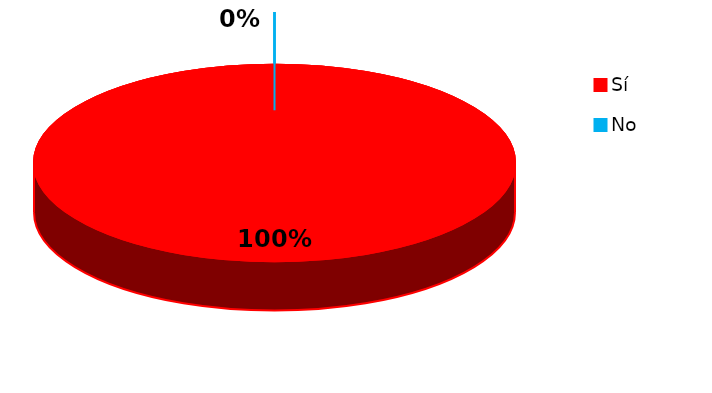
| Category | Series 0 |
|---|---|
| 0 | 43 |
| 1 | 0 |